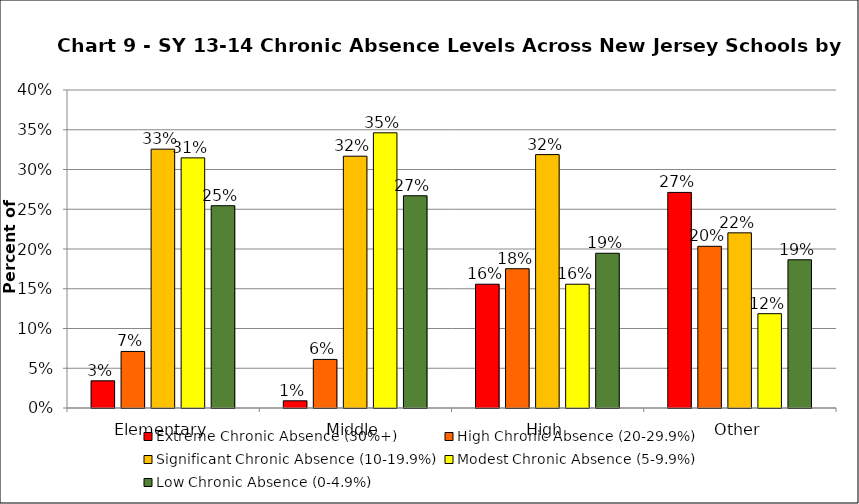
| Category | Extreme Chronic Absence (30%+) | High Chronic Absence (20-29.9%) | Significant Chronic Absence (10-19.9%) | Modest Chronic Absence (5-9.9%) | Low Chronic Absence (0-4.9%) |
|---|---|---|---|---|---|
| 0 | 0.034 | 0.071 | 0.326 | 0.315 | 0.254 |
| 1 | 0.009 | 0.061 | 0.317 | 0.346 | 0.267 |
| 2 | 0.156 | 0.175 | 0.319 | 0.156 | 0.195 |
| 3 | 0.271 | 0.203 | 0.22 | 0.119 | 0.186 |